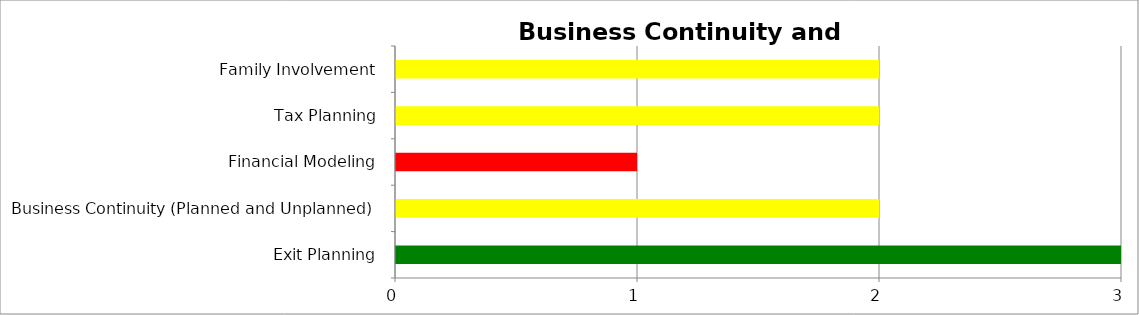
| Category | Series 0 | Series 1 | Series 2 |
|---|---|---|---|
| Exit Planning | 3 | 0 | 0 |
| Business Continuity (Planned and Unplanned) | 0 | 2 | 0 |
| Financial Modeling | 0 | 0 | 1 |
| Tax Planning | 0 | 2 | 0 |
| Family Involvement | 0 | 2 | 0 |